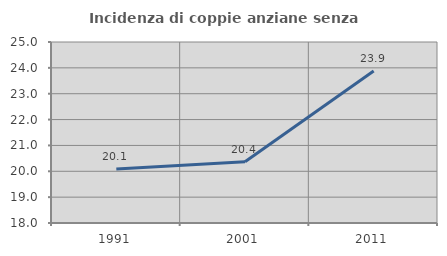
| Category | Incidenza di coppie anziane senza figli  |
|---|---|
| 1991.0 | 20.091 |
| 2001.0 | 20.37 |
| 2011.0 | 23.881 |